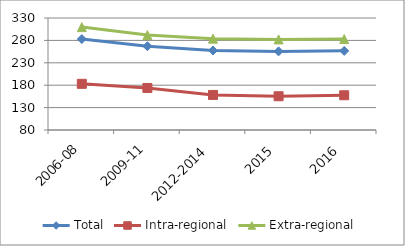
| Category | Total | Intra-regional | Extra-regional |
|---|---|---|---|
| 2006-08 | 283.008 | 183.071 | 309.657 |
| 2009-11 | 267.014 | 173.825 | 291.865 |
| 2012-2014 | 257.463 | 158.299 | 283.907 |
| 2015 | 255.482 | 155.33 | 282.19 |
| 2016 | 256.62 | 157.553 | 283.037 |